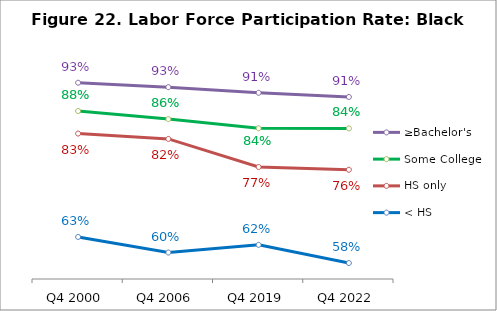
| Category | ≥Bachelor's | Some College | HS only | < HS |
|---|---|---|---|---|
| Q4 2000 | 0.934 | 0.879 | 0.835 | 0.632 |
| Q4 2006 | 0.925 | 0.863 | 0.824 | 0.602 |
| Q4 2019 | 0.914 | 0.845 | 0.769 | 0.617 |
| Q4 2022 | 0.906 | 0.845 | 0.764 | 0.581 |